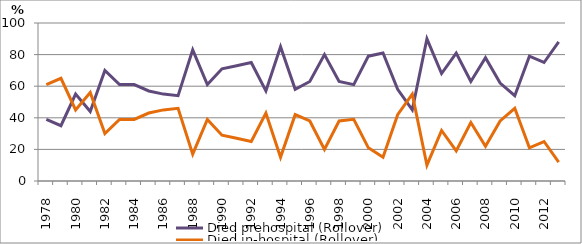
| Category | Died prehospital (Rollover) | Died in-hospital (Rollover) |
|---|---|---|
| 1978.0 | 39 | 61 |
| 1979.0 | 35 | 65 |
| 1980.0 | 55 | 45 |
| 1981.0 | 44 | 56 |
| 1982.0 | 70 | 30 |
| 1983.0 | 61 | 39 |
| 1984.0 | 61 | 39 |
| 1985.0 | 57 | 43 |
| 1986.0 | 55 | 45 |
| 1987.0 | 54 | 46 |
| 1988.0 | 83 | 17 |
| 1989.0 | 61 | 39 |
| 1990.0 | 71 | 29 |
| 1991.0 | 73 | 27 |
| 1992.0 | 75 | 25 |
| 1993.0 | 57 | 43 |
| 1994.0 | 85 | 15 |
| 1995.0 | 58 | 42 |
| 1996.0 | 63 | 38 |
| 1997.0 | 80 | 20 |
| 1998.0 | 63 | 38 |
| 1999.0 | 61 | 39 |
| 2000.0 | 79 | 21 |
| 2001.0 | 81 | 15 |
| 2002.0 | 58 | 42 |
| 2003.0 | 45 | 55 |
| 2004.0 | 90 | 10 |
| 2005.0 | 68 | 32 |
| 2006.0 | 81 | 19 |
| 2007.0 | 63 | 37 |
| 2008.0 | 78 | 22 |
| 2009.0 | 62 | 38 |
| 2010.0 | 54 | 46 |
| 2011.0 | 79 | 21 |
| 2012.0 | 75 | 25 |
| 2013.0 | 88 | 12 |